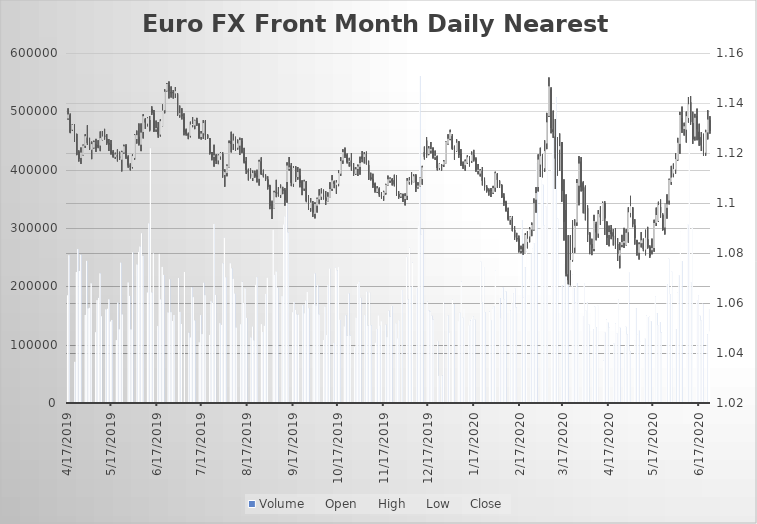
| Category | Volume |
|---|---|
| 4/17/19 | 184443 |
| 4/18/19 | 253387 |
| 4/22/19 | 70476 |
| 4/23/19 | 224413 |
| 4/24/19 | 263952 |
| 4/25/19 | 226181 |
| 4/26/19 | 254031 |
| 4/29/19 | 150906 |
| 4/30/19 | 243558 |
| 5/1/19 | 162143 |
| 5/2/19 | 163209 |
| 5/3/19 | 205195 |
| 5/6/19 | 121218 |
| 5/7/19 | 176296 |
| 5/8/19 | 180222 |
| 5/9/19 | 222222 |
| 5/10/19 | 148422 |
| 5/13/19 | 160360 |
| 5/14/19 | 161357 |
| 5/15/19 | 177617 |
| 5/16/19 | 139482 |
| 5/17/19 | 142331 |
| 5/20/19 | 107746 |
| 5/21/19 | 171890 |
| 5/22/19 | 126258 |
| 5/23/19 | 240487 |
| 5/24/19 | 151706 |
| 5/28/19 | 206639 |
| 5/29/19 | 183465 |
| 5/30/19 | 126119 |
| 5/31/19 | 258132 |
| 6/3/19 | 237367 |
| 6/4/19 | 259080 |
| 6/5/19 | 268165 |
| 6/6/19 | 290766 |
| 6/7/19 | 252288 |
| 6/10/19 | 189337 |
| 6/11/19 | 307807 |
| 6/12/19 | 436690 |
| 6/13/19 | 189280 |
| 6/14/19 | 256303 |
| 6/17/19 | 131890 |
| 6/18/19 | 255530 |
| 6/19/19 | 177411 |
| 6/20/19 | 233211 |
| 6/21/19 | 219540 |
| 6/24/19 | 155150 |
| 6/25/19 | 211965 |
| 6/26/19 | 155624 |
| 6/27/19 | 140478 |
| 6/28/19 | 150820 |
| 7/1/19 | 214112 |
| 7/2/19 | 156093 |
| 7/3/19 | 135337 |
| 7/5/19 | 224589 |
| 7/8/19 | 120331 |
| 7/9/19 | 112359 |
| 7/10/19 | 198215 |
| 7/11/19 | 181383 |
| 7/12/19 | 141380 |
| 7/15/19 | 104102 |
| 7/16/19 | 150627 |
| 7/17/19 | 118100 |
| 7/18/19 | 206122 |
| 7/19/19 | 184793 |
| 7/22/19 | 116579 |
| 7/23/19 | 174305 |
| 7/24/19 | 171721 |
| 7/25/19 | 306855 |
| 7/26/19 | 185146 |
| 7/29/19 | 136746 |
| 7/30/19 | 133778 |
| 7/31/19 | 239383 |
| 8/1/19 | 283259 |
| 8/2/19 | 215301 |
| 8/5/19 | 239517 |
| 8/6/19 | 230617 |
| 8/7/19 | 212715 |
| 8/8/19 | 187411 |
| 8/9/19 | 129361 |
| 8/12/19 | 134930 |
| 8/13/19 | 207706 |
| 8/14/19 | 171352 |
| 8/15/19 | 196530 |
| 8/16/19 | 145844 |
| 8/19/19 | 112292 |
| 8/20/19 | 130817 |
| 8/21/19 | 107256 |
| 8/22/19 | 202399 |
| 8/23/19 | 215588 |
| 8/26/19 | 135087 |
| 8/27/19 | 121813 |
| 8/28/19 | 132449 |
| 8/29/19 | 186886 |
| 8/30/19 | 214473 |
| 9/3/19 | 296655 |
| 9/4/19 | 219746 |
| 9/5/19 | 225438 |
| 9/6/19 | 197420 |
| 9/9/19 | 183127 |
| 9/10/19 | 306069 |
| 9/11/19 | 319817 |
| 9/12/19 | 406694 |
| 9/13/19 | 292235 |
| 9/16/19 | 155489 |
| 9/17/19 | 173206 |
| 9/18/19 | 159348 |
| 9/19/19 | 151643 |
| 9/20/19 | 151007 |
| 9/23/19 | 167595 |
| 9/24/19 | 153767 |
| 9/25/19 | 175587 |
| 9/26/19 | 190182 |
| 9/27/19 | 162479 |
| 9/30/19 | 169462 |
| 10/1/19 | 221896 |
| 10/2/19 | 166893 |
| 10/3/19 | 202051 |
| 10/4/19 | 151742 |
| 10/7/19 | 107878 |
| 10/8/19 | 165114 |
| 10/9/19 | 116311 |
| 10/10/19 | 201895 |
| 10/11/19 | 230306 |
| 10/14/19 | 102714 |
| 10/15/19 | 232135 |
| 10/16/19 | 226959 |
| 10/17/19 | 232895 |
| 10/18/19 | 142494 |
| 10/21/19 | 131323 |
| 10/22/19 | 150232 |
| 10/23/19 | 115184 |
| 10/24/19 | 187670 |
| 10/25/19 | 115546 |
| 10/28/19 | 95771 |
| 10/29/19 | 146337 |
| 10/30/19 | 204065 |
| 10/31/19 | 208008 |
| 11/1/19 | 180420 |
| 11/4/19 | 150669 |
| 11/5/19 | 190829 |
| 11/6/19 | 132314 |
| 11/7/19 | 189456 |
| 11/8/19 | 132856 |
| 11/11/19 | 103459 |
| 11/12/19 | 126709 |
| 11/13/19 | 150184 |
| 11/14/19 | 132498 |
| 11/15/19 | 140148 |
| 11/18/19 | 134057 |
| 11/19/19 | 112903 |
| 11/20/19 | 157999 |
| 11/21/19 | 147805 |
| 11/22/19 | 166247 |
| 11/25/19 | 136427 |
| 11/26/19 | 110868 |
| 11/27/19 | 141835 |
| 11/29/19 | 193646 |
| 12/2/19 | 251056 |
| 12/3/19 | 177238 |
| 12/4/19 | 266105 |
| 12/5/19 | 199336 |
| 12/6/19 | 240326 |
| 12/9/19 | 197297 |
| 12/10/19 | 304698 |
| 12/11/19 | 560754 |
| 12/12/19 | 288561 |
| 12/13/19 | 297265 |
| 12/16/19 | 173496 |
| 12/17/19 | 158423 |
| 12/18/19 | 156483 |
| 12/19/19 | 149558 |
| 12/20/19 | 142684 |
| 12/23/19 | 105834 |
| 12/24/19 | 46420 |
| 12/26/19 | 46551 |
| 12/27/19 | 172945 |
| 12/30/19 | 149563 |
| 12/31/19 | 119988 |
| 1/2/20 | 177128 |
| 1/3/20 | 169558 |
| 1/6/20 | 140402 |
| 1/7/20 | 154584 |
| 1/8/20 | 208215 |
| 1/9/20 | 146070 |
| 1/10/20 | 161272 |
| 1/13/20 | 133271 |
| 1/14/20 | 141237 |
| 1/15/20 | 143915 |
| 1/16/20 | 147897 |
| 1/17/20 | 143037 |
| 1/21/20 | 242557 |
| 1/22/20 | 172395 |
| 1/23/20 | 233357 |
| 1/24/20 | 155251 |
| 1/27/20 | 156277 |
| 1/28/20 | 142025 |
| 1/29/20 | 162183 |
| 1/30/20 | 165288 |
| 1/31/20 | 227529 |
| 2/3/20 | 179792 |
| 2/4/20 | 145542 |
| 2/5/20 | 197878 |
| 2/6/20 | 177799 |
| 2/7/20 | 191000 |
| 2/10/20 | 158712 |
| 2/11/20 | 171113 |
| 2/12/20 | 188198 |
| 2/13/20 | 196589 |
| 2/14/20 | 163585 |
| 2/18/20 | 313856 |
| 2/19/20 | 180548 |
| 2/20/20 | 232080 |
| 2/21/20 | 259525 |
| 2/24/20 | 255787 |
| 2/25/20 | 265324 |
| 2/26/20 | 273653 |
| 2/27/20 | 369600 |
| 2/28/20 | 410546 |
| 3/2/20 | 440293 |
| 3/3/20 | 374128 |
| 3/4/20 | 304342 |
| 3/5/20 | 336945 |
| 3/6/20 | 424461 |
| 3/9/20 | 424629 |
| 3/10/20 | 466261 |
| 3/11/20 | 493256 |
| 3/12/20 | 524008 |
| 3/13/20 | 315747 |
| 3/16/20 | 201396 |
| 3/17/20 | 196868 |
| 3/18/20 | 237544 |
| 3/19/20 | 277211 |
| 3/20/20 | 251136 |
| 3/23/20 | 219818 |
| 3/24/20 | 196644 |
| 3/25/20 | 171720 |
| 3/26/20 | 205611 |
| 3/27/20 | 198780 |
| 3/30/20 | 149226 |
| 3/31/20 | 205731 |
| 4/1/20 | 158748 |
| 4/2/20 | 172086 |
| 4/3/20 | 134612 |
| 4/6/20 | 126450 |
| 4/7/20 | 165316 |
| 4/8/20 | 130074 |
| 4/9/20 | 167526 |
| 4/13/20 | 72771 |
| 4/14/20 | 120234 |
| 4/15/20 | 142554 |
| 4/16/20 | 137628 |
| 4/17/20 | 129194 |
| 4/20/20 | 101892 |
| 4/21/20 | 136304 |
| 4/22/20 | 119418 |
| 4/23/20 | 177571 |
| 4/24/20 | 129111 |
| 4/27/20 | 96001 |
| 4/28/20 | 130730 |
| 4/29/20 | 117506 |
| 4/30/20 | 224340 |
| 5/1/20 | 88703 |
| 5/4/20 | 107609 |
| 5/5/20 | 162382 |
| 5/6/20 | 117816 |
| 5/7/20 | 123984 |
| 5/8/20 | 105989 |
| 5/11/20 | 110064 |
| 5/12/20 | 149471 |
| 5/13/20 | 147605 |
| 5/14/20 | 148648 |
| 5/15/20 | 140207 |
| 5/18/20 | 182678 |
| 5/19/20 | 154098 |
| 5/20/20 | 133456 |
| 5/21/20 | 138798 |
| 5/22/20 | 120721 |
| 5/26/20 | 203562 |
| 5/27/20 | 247118 |
| 5/28/20 | 186555 |
| 5/29/20 | 225494 |
| 6/1/20 | 126750 |
| 6/2/20 | 189688 |
| 6/3/20 | 218626 |
| 6/4/20 | 294675 |
| 6/5/20 | 243548 |
| 6/8/20 | 193781 |
| 6/9/20 | 305661 |
| 6/10/20 | 499266 |
| 6/11/20 | 207094 |
| 6/12/20 | 301427 |
| 6/15/20 | 176721 |
| 6/16/20 | 183980 |
| 6/17/20 | 149634 |
| 6/18/20 | 141141 |
| 6/19/20 | 170181 |
| 6/22/20 | 117766 |
| 6/23/20 | 161289 |
| 6/24/20 | 122678 |